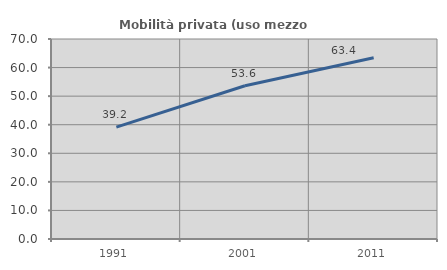
| Category | Mobilità privata (uso mezzo privato) |
|---|---|
| 1991.0 | 39.178 |
| 2001.0 | 53.64 |
| 2011.0 | 63.42 |